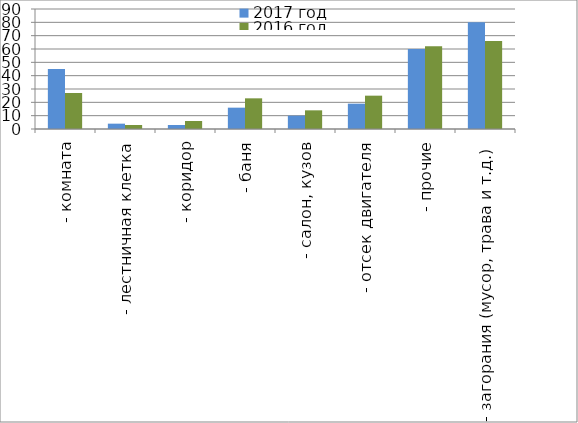
| Category | 2017 год | 2016 год |
|---|---|---|
|  - комната | 45 | 27 |
|  - лестничная клетка | 4 | 3 |
|  - коридор | 3 | 6 |
|  - баня | 16 | 23 |
|  - салон, кузов | 10 | 14 |
|  - отсек двигателя | 19 | 25 |
| - прочие | 60 | 62 |
| - загорания (мусор, трава и т.д.)  | 80 | 66 |